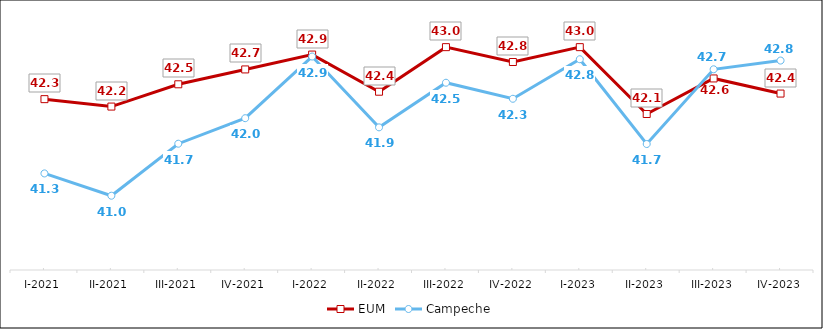
| Category | EUM | Campeche |
|---|---|---|
| I-2021 | 42.3 | 41.3 |
| II-2021 | 42.2 | 41 |
| III-2021 | 42.5 | 41.7 |
| IV-2021 | 42.7 | 42.044 |
| I-2022 | 42.9 | 42.874 |
| II-2022 | 42.4 | 41.92 |
| III-2022 | 43 | 42.521 |
| IV-2022 | 42.8 | 42.305 |
| I-2023 | 43 | 42.837 |
| II-2023 | 42.1 | 41.696 |
| III-2023 | 42.579 | 42.702 |
| IV-2023 | 42.375 | 42.819 |